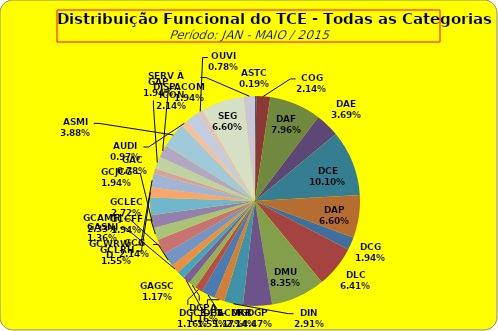
| Category | ASTC COG DAF DAE DCE DAP DCG DLC DMU DGP DIN DPE DRR DGCE DGPA GACMG GAGSC GASNI GCG GCAMFJ GCCFF GCJCG GCLEC GCLRH GCWRWD GAC GAP ACOM ASMI AUDI ICON OUVI SEG SERV À DISP. |
|---|---|
| ASTC | 1 |
| COG | 11 |
| DAF | 41 |
| DAE | 19 |
| DCE | 52 |
| DAP | 34 |
| DCG | 10 |
| DLC | 33 |
| DMU | 43 |
| DGP | 23 |
| DIN | 15 |
| DPE | 8 |
| DRR | 11 |
| DGCE | 6 |
| DGPA | 6 |
| GACMG | 6 |
| GAGSC | 6 |
| GASNI | 7 |
| GCG | 11 |
| GCAMFJ | 12 |
| GCCFF | 10 |
| GCJCG | 10 |
| GCLEC | 14 |
| GCLRH | 8 |
| GCWRWD | 11 |
| GAC | 4 |
| GAP | 10 |
| ACOM | 10 |
| ASMI | 20 |
| AUDI | 5 |
| ICON | 11 |
| OUVI | 4 |
| SEG | 34 |
| SERV À DISP. | 9 |